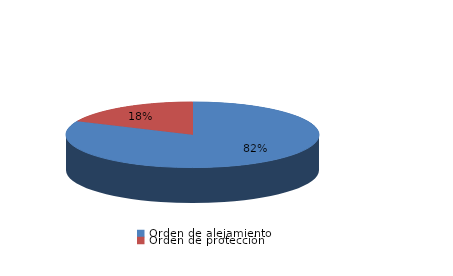
| Category | Series 0 |
|---|---|
| Orden de alejamiento | 9 |
| Orden de protección | 2 |